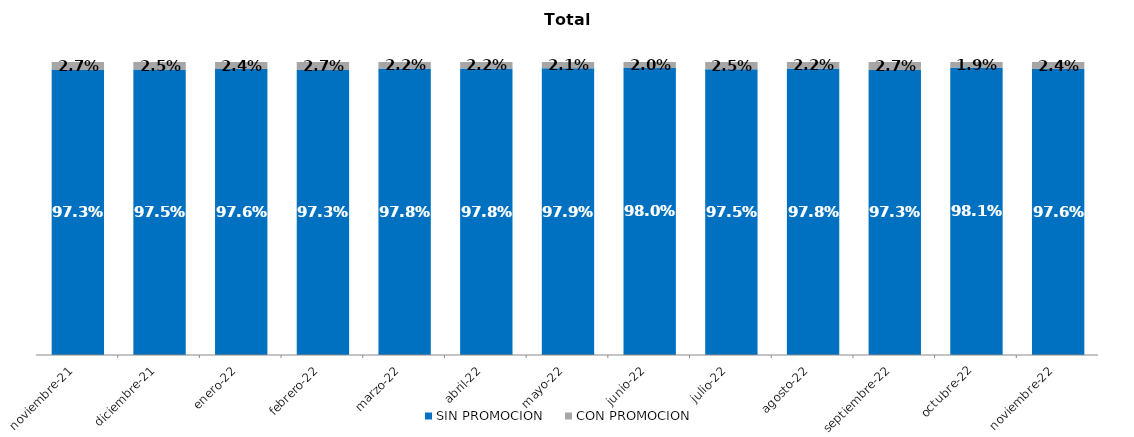
| Category | SIN PROMOCION   | CON PROMOCION   |
|---|---|---|
| 2021-11-01 | 0.973 | 0.027 |
| 2021-12-01 | 0.975 | 0.025 |
| 2022-01-01 | 0.976 | 0.024 |
| 2022-02-01 | 0.973 | 0.027 |
| 2022-03-01 | 0.978 | 0.022 |
| 2022-04-01 | 0.978 | 0.022 |
| 2022-05-01 | 0.979 | 0.021 |
| 2022-06-01 | 0.98 | 0.02 |
| 2022-07-01 | 0.975 | 0.025 |
| 2022-08-01 | 0.978 | 0.022 |
| 2022-09-01 | 0.973 | 0.027 |
| 2022-10-01 | 0.981 | 0.019 |
| 2022-11-01 | 0.976 | 0.024 |